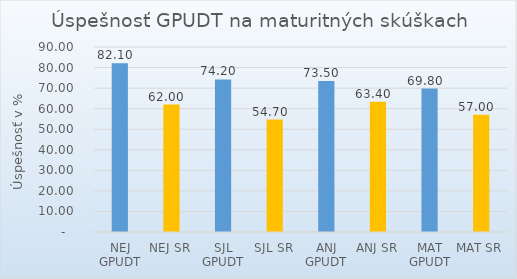
| Category | Series 0 |
|---|---|
| NEJ GPUDT | 82.1 |
| NEJ SR | 62 |
| SJL GPUDT | 74.2 |
| SJL SR | 54.7 |
| ANJ GPUDT | 73.5 |
| ANJ SR | 63.4 |
| MAT GPUDT | 69.8 |
| MAT SR | 57 |